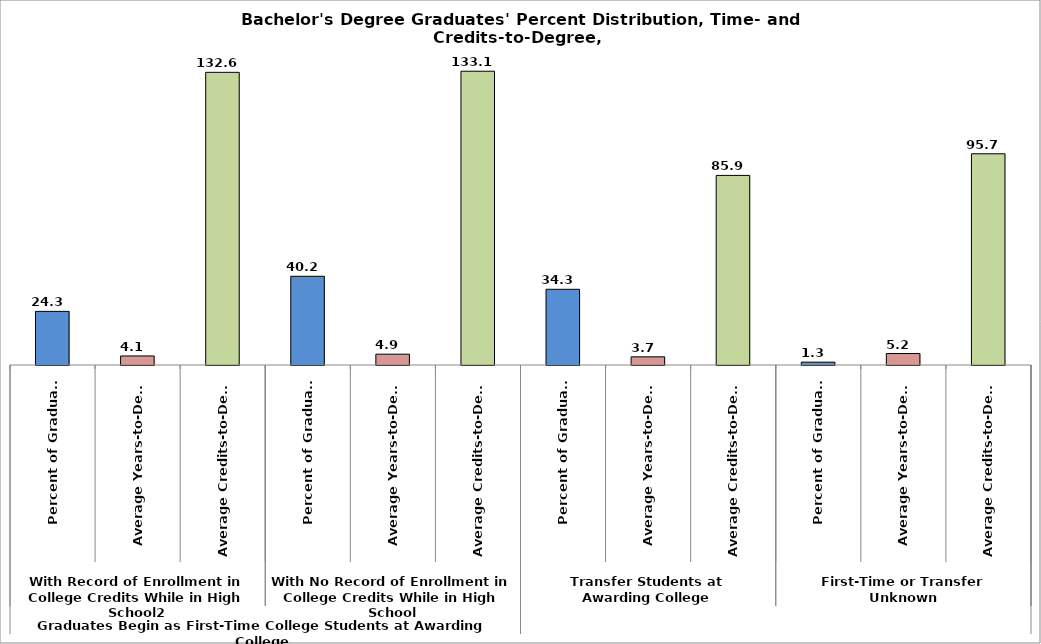
| Category | Series 0 |
|---|---|
| 0 | 24.3 |
| 1 | 4.1 |
| 2 | 132.6 |
| 3 | 40.2 |
| 4 | 4.9 |
| 5 | 133.1 |
| 6 | 34.3 |
| 7 | 3.7 |
| 8 | 85.9 |
| 9 | 1.3 |
| 10 | 5.2 |
| 11 | 95.7 |